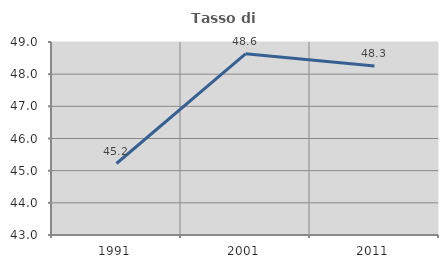
| Category | Tasso di occupazione   |
|---|---|
| 1991.0 | 45.223 |
| 2001.0 | 48.632 |
| 2011.0 | 48.253 |